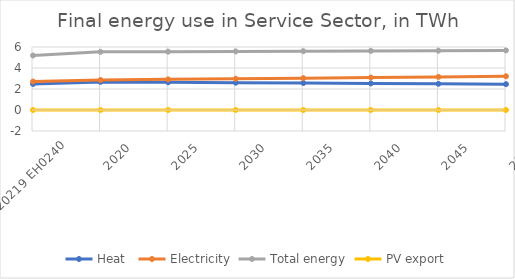
| Category | Heat  | Electricity | Total energy | PV export |
|---|---|---|---|---|
| 2010-20219 EH0240 | 2.48 | 2.71 | 5.19 | 0 |
| 2020 | 2.677 | 2.86 | 5.537 | 0 |
| 2025 | 2.638 | 2.918 | 5.556 | 0 |
| 2030 | 2.601 | 2.977 | 5.578 | 0 |
| 2035 | 2.566 | 3.036 | 5.601 | -0.001 |
| 2040 | 2.531 | 3.095 | 5.625 | -0.001 |
| 2045 | 2.495 | 3.154 | 5.649 | -0.001 |
| 2050 | 2.46 | 3.213 | 5.673 | -0.001 |